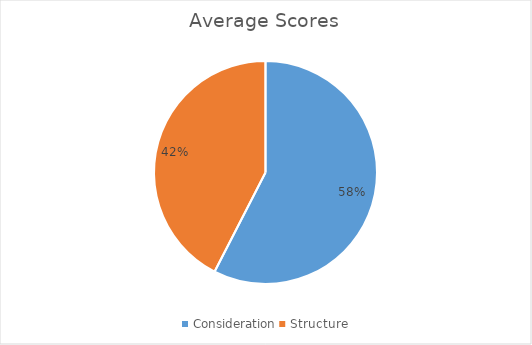
| Category | Series 0 |
|---|---|
| Consideration | 59.2 |
| Structure | 43.667 |